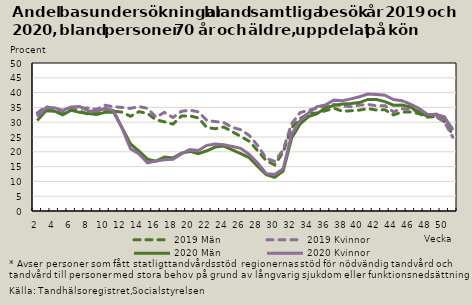
| Category | 2019 | 2020 |
|---|---|---|
| 2.0 | 33.084 | 31.81 |
| 3.0 | 35.292 | 34.818 |
| 4.0 | 34.552 | 34.904 |
| 5.0 | 33.816 | 33.981 |
| 6.0 | 34.697 | 35.125 |
| 7.0 | 34.8 | 35.319 |
| 8.0 | 34.814 | 33.832 |
| 9.0 | 34.338 | 33.692 |
| 10.0 | 35.707 | 34.686 |
| 11.0 | 35.23 | 33.942 |
| 12.0 | 34.972 | 27.988 |
| 13.0 | 34.666 | 21.028 |
| 14.0 | 35.278 | 19.28 |
| 15.0 | 34.674 | 16.278 |
| 16.0 | 31.715 | 16.912 |
| 17.0 | 33.326 | 17.287 |
| 18.0 | 31.583 | 17.487 |
| 19.0 | 33.67 | 19.291 |
| 20.0 | 34.067 | 20.779 |
| 21.0 | 33.502 | 20.416 |
| 22.0 | 30.611 | 22.18 |
| 23.0 | 30.215 | 22.664 |
| 24.0 | 29.875 | 22.4 |
| 25.0 | 28.243 | 21.798 |
| 26.0 | 27.459 | 21.179 |
| 27.0 | 25.524 | 19.094 |
| 28.0 | 22.074 | 16.216 |
| 29.0 | 17.785 | 12.671 |
| 30.0 | 16.783 | 12.331 |
| 31.0 | 20.594 | 14.256 |
| 32.0 | 29.458 | 25.926 |
| 33.0 | 33.234 | 30.578 |
| 34.0 | 34.063 | 33.149 |
| 35.0 | 34.713 | 35.275 |
| 36.0 | 35.591 | 35.839 |
| 37.0 | 35.978 | 37.492 |
| 38.0 | 35.515 | 37.286 |
| 39.0 | 35.245 | 37.872 |
| 40.0 | 35.774 | 38.58 |
| 41.0 | 35.979 | 39.497 |
| 42.0 | 35.566 | 39.366 |
| 43.0 | 35.598 | 39.137 |
| 44.0 | 33.501 | 37.646 |
| 45.0 | 34.538 | 37.263 |
| 46.0 | 34.278 | 36.147 |
| 47.0 | 33.684 | 34.668 |
| 48.0 | 32.559 | 32.723 |
| 49.0 | 32 | 32.485 |
| 50.0 | 30.217 | 31.875 |
| 51.0 | 24.944 | 27.277 |